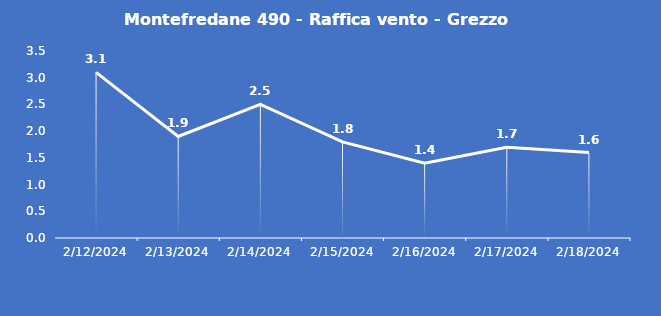
| Category | Montefredane 490 - Raffica vento - Grezzo (m/s) |
|---|---|
| 2/12/24 | 3.1 |
| 2/13/24 | 1.9 |
| 2/14/24 | 2.5 |
| 2/15/24 | 1.8 |
| 2/16/24 | 1.4 |
| 2/17/24 | 1.7 |
| 2/18/24 | 1.6 |